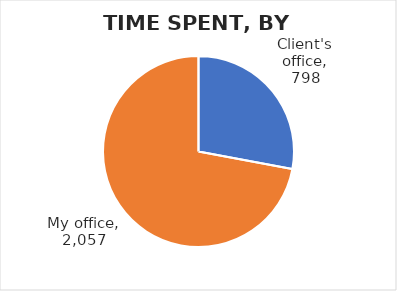
| Category | Total minutes |
|---|---|
| Client's office | 798 |
| My office | 2057 |